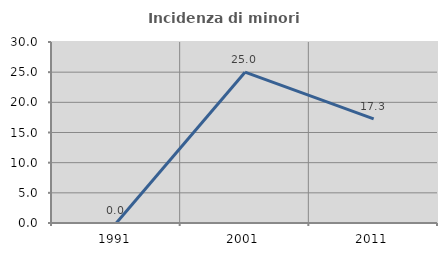
| Category | Incidenza di minori stranieri |
|---|---|
| 1991.0 | 0 |
| 2001.0 | 25 |
| 2011.0 | 17.273 |